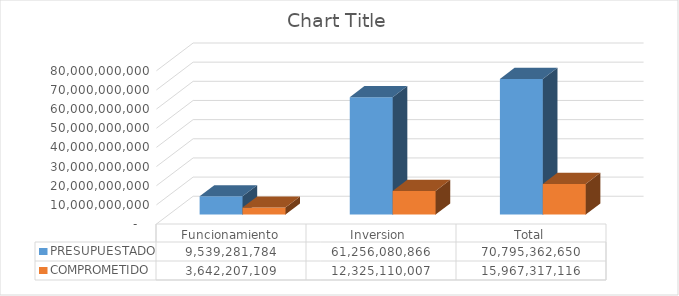
| Category | PRESUPUESTADO | COMPROMETIDO |
|---|---|---|
| Funcionamiento | 9539281784 | 3642207109 |
| Inversion  | 61256080866 | 12325110007 |
| Total | 70795362650 | 15967317116 |